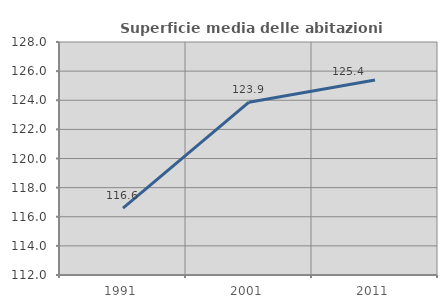
| Category | Superficie media delle abitazioni occupate |
|---|---|
| 1991.0 | 116.594 |
| 2001.0 | 123.866 |
| 2011.0 | 125.395 |